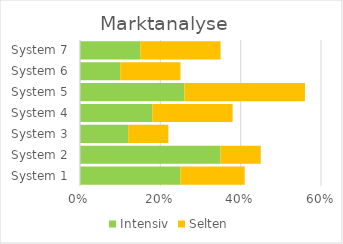
| Category | Intensiv | Selten |
|---|---|---|
| System 1 | 0.25 | 0.16 |
| System 2 | 0.35 | 0.1 |
| System 3 | 0.12 | 0.1 |
| System 4 | 0.18 | 0.2 |
| System 5 | 0.26 | 0.3 |
| System 6 | 0.1 | 0.15 |
| System 7 | 0.15 | 0.2 |